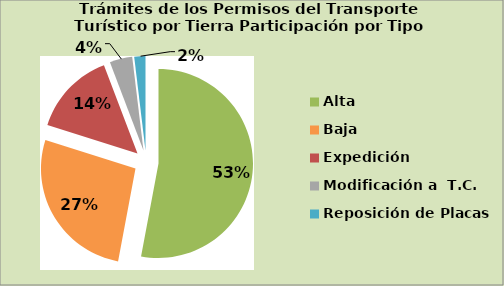
| Category | Series 0 |
|---|---|
| Alta                                         | 52.954 |
| Baja | 26.908 |
| Expedición | 14.36 |
| Modificación a  T.C. | 3.867 |
| Reposición de Placas | 1.912 |